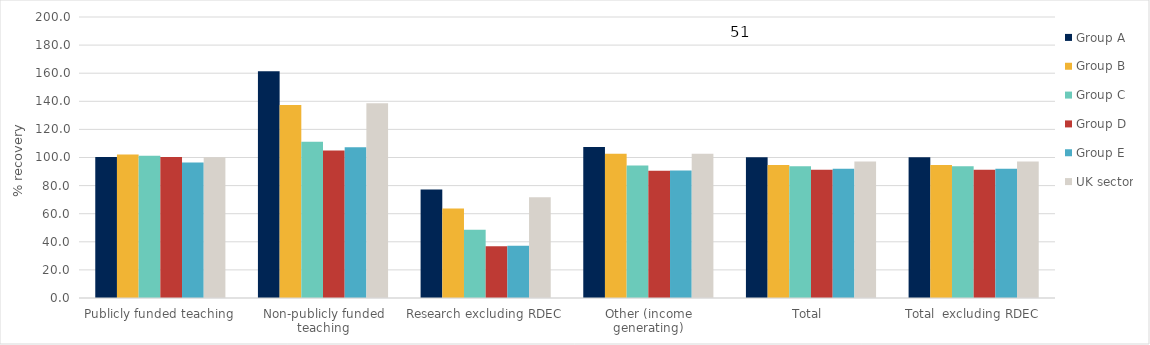
| Category | Group A | Group B | Group C | Group D | Group E | UK sector |
|---|---|---|---|---|---|---|
| Publicly funded teaching | 100.276 | 102.211 | 101.306 | 100.347 | 96.494 | 100.13 |
| Non-publicly funded teaching | 161.369 | 137.318 | 111.189 | 105.044 | 107.354 | 138.594 |
| Research excluding RDEC | 77.155 | 63.757 | 48.648 | 36.793 | 37.109 | 71.706 |
| Other (income generating) | 107.554 | 102.585 | 94.386 | 90.52 | 90.7 | 102.68 |
| Total  | 100.26 | 94.624 | 93.781 | 91.305 | 92.077 | 97.126 |
| Total  excluding RDEC | 100.171 | 94.608 | 93.751 | 91.291 | 92.077 | 97.068 |